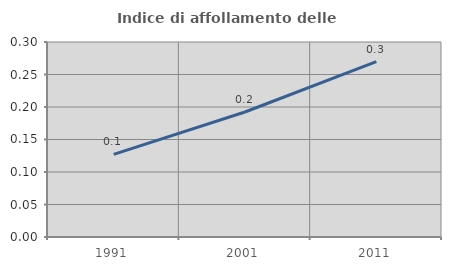
| Category | Indice di affollamento delle abitazioni  |
|---|---|
| 1991.0 | 0.127 |
| 2001.0 | 0.192 |
| 2011.0 | 0.27 |